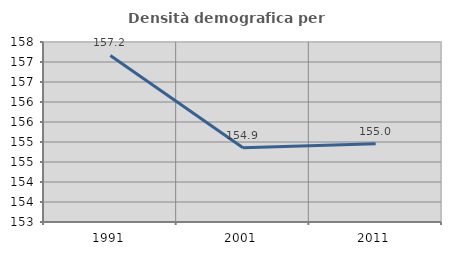
| Category | Densità demografica |
|---|---|
| 1991.0 | 157.163 |
| 2001.0 | 154.854 |
| 2011.0 | 154.957 |